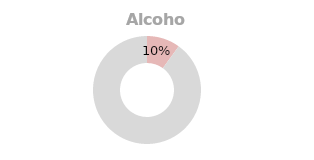
| Category | Alcohol |
|---|---|
| 0 | 0.1 |
| 1 | 0.9 |